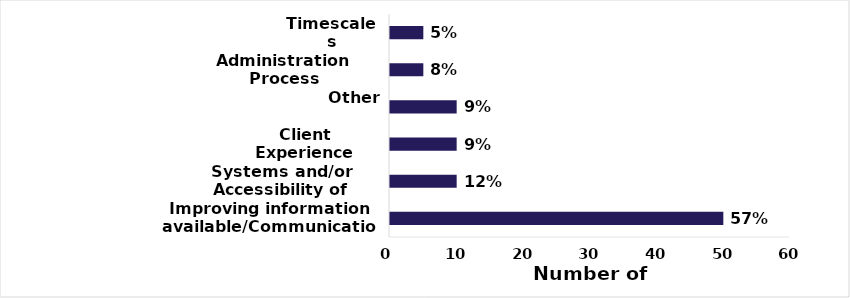
| Category | Series 0 |
|---|---|
| Improving information available/Communications | 50 |
| Systems and/or Accessibility of services | 10 |
| Client Experience | 10 |
| Other | 10 |
| Administration Process | 5 |
| Timescales | 5 |